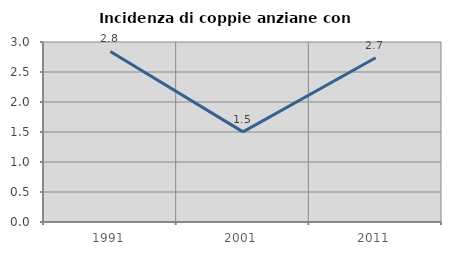
| Category | Incidenza di coppie anziane con figli |
|---|---|
| 1991.0 | 2.842 |
| 2001.0 | 1.502 |
| 2011.0 | 2.737 |